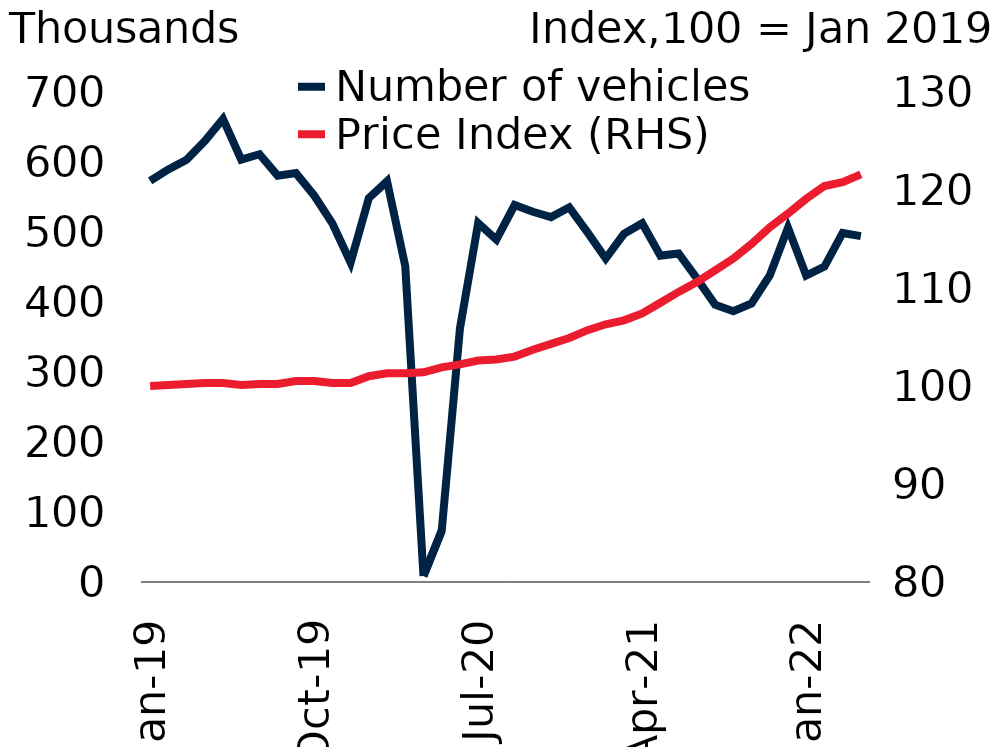
| Category | Number of vehicles |
|---|---|
| 2019-01-31 | 572888 |
| 2019-02-28 | 589497 |
| 2019-03-31 | 603064 |
| 2019-04-30 | 629882 |
| 2019-05-31 | 661515 |
| 2019-06-30 | 603465 |
| 2019-07-31 | 611038 |
| 2019-08-31 | 580428 |
| 2019-09-30 | 584076 |
| 2019-10-31 | 552221 |
| 2019-11-30 | 512244 |
| 2019-12-31 | 456475 |
| 2020-01-31 | 548316 |
| 2020-02-29 | 572515 |
| 2020-03-31 | 451131 |
| 2020-04-30 | 8695 |
| 2020-05-31 | 73211 |
| 2020-06-30 | 362174 |
| 2020-07-31 | 512699 |
| 2020-08-31 | 489153 |
| 2020-09-30 | 538543 |
| 2020-10-31 | 528980 |
| 2020-11-30 | 521309 |
| 2020-12-31 | 535224 |
| 2021-01-31 | 499516 |
| 2021-02-28 | 462136 |
| 2021-03-31 | 497403 |
| 2021-04-30 | 512538 |
| 2021-05-31 | 466292 |
| 2021-06-30 | 469337 |
| 2021-07-31 | 433765 |
| 2021-08-31 | 396227 |
| 2021-09-30 | 386904 |
| 2021-10-31 | 397897 |
| 2021-11-30 | 437829 |
| 2021-12-31 | 506192 |
| 2022-01-31 | 437754 |
| 2022-02-28 | 450617 |
| 2022-03-31 | 498649 |
| 2022-04-30 | 494092 |